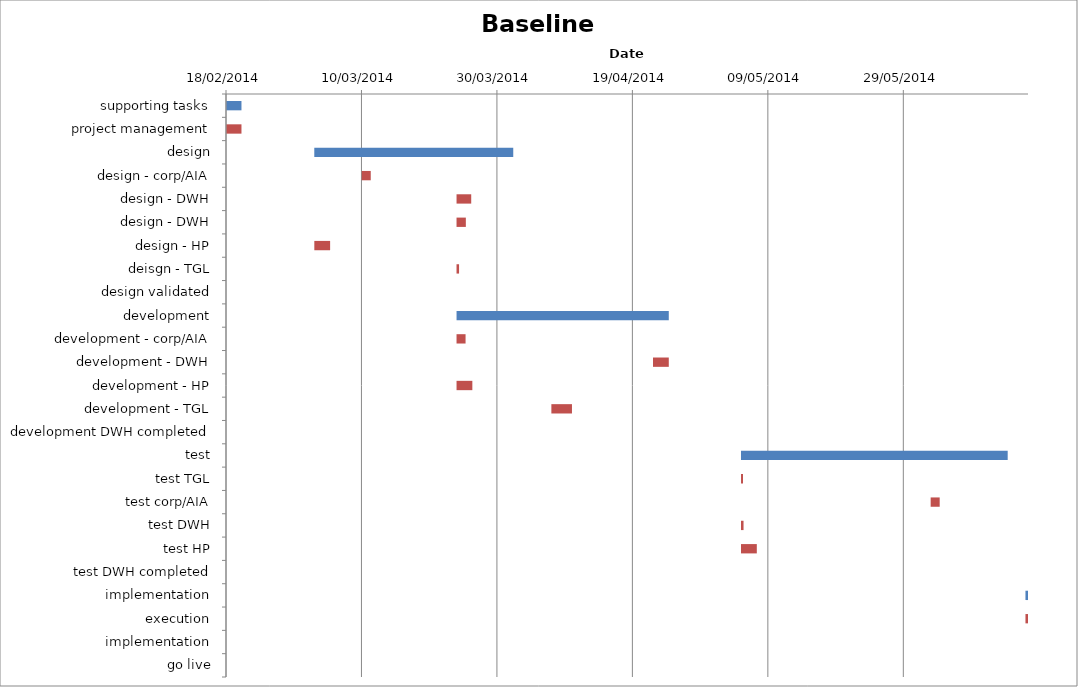
| Category | Baseline start | Actual duration |
|---|---|---|
| supporting tasks | 41688.333 | 2.25 |
| project management | 41688.333 | 2.25 |
| design | 41701.333 | 29.375 |
| design - corp/AIA | 41708.333 | 1.333 |
| design - DWH | 41722.333 | 2.167 |
| design - DWH | 41722.333 | 1.375 |
| design - HP | 41701.333 | 2.333 |
| deisgn - TGL | 41722.333 | 0.375 |
| design validated | 41730.708 | 0 |
| development | 41722.333 | 31.333 |
| development - corp/AIA | 41722.333 | 1.333 |
| development - DWH | 41751.333 | 2.333 |
| development - HP | 41722.333 | 2.333 |
| development - TGL | 41736.333 | 3.042 |
| development DWH completed | 41747.708 | 0 |
| test | 41764.333 | 39.375 |
| test TGL | 41764.333 | 0.292 |
| test corp/AIA | 41792.333 | 1.333 |
| test DWH | 41764.333 | 0.375 |
| test HP | 41764.333 | 2.333 |
| test DWH completed | 41803.708 | 0 |
| implementation | 41806.333 | 0.375 |
| execution | 41806.333 | 0.375 |
| implementation | 41806.708 | 0 |
| go live | 41806.708 | 0 |